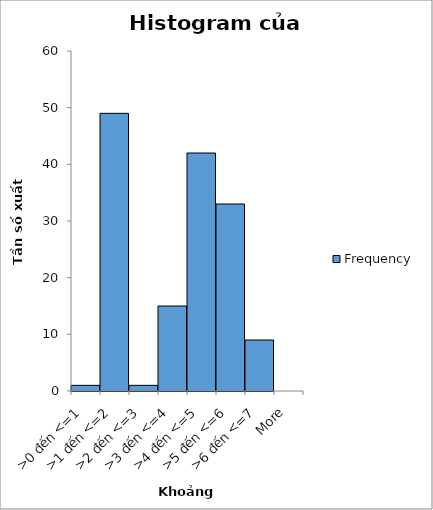
| Category | Frequency |
|---|---|
| >0 đến <=1 | 1 |
| >1 đến <=2 | 49 |
| >2 đến <=3 | 1 |
| >3 đến <=4 | 15 |
| >4 đến <=5 | 42 |
| >5 đến <=6 | 33 |
| >6 đến <=7 | 9 |
| More | 0 |